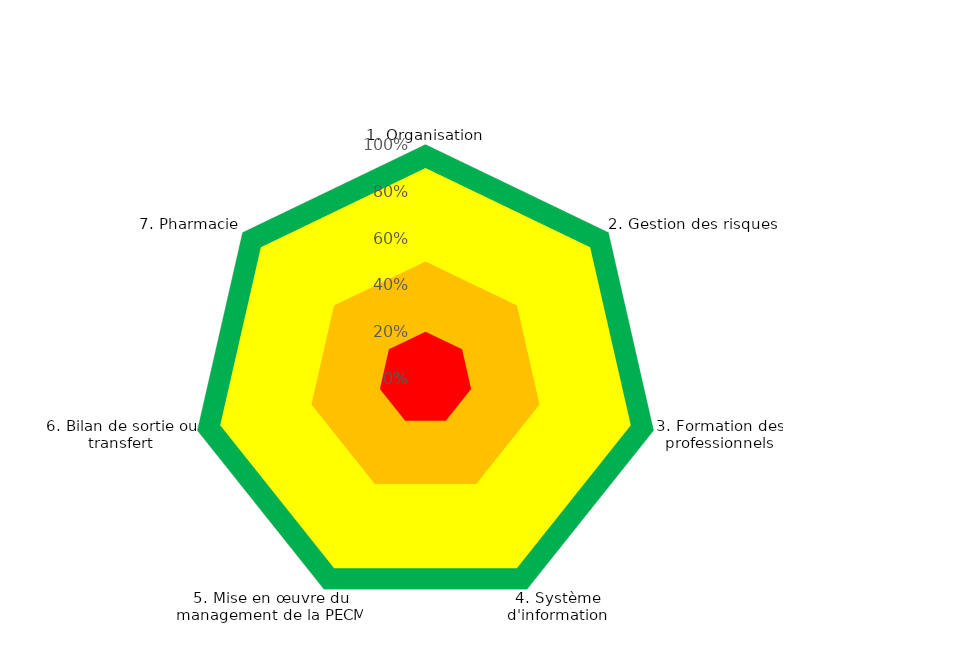
| Category | Series 1 | Zone 3 | Zone 2 | Zone 1 | Niveau de conformité |
|---|---|---|---|---|---|
| 1. Organisation | 1 | 0.9 | 0.5 | 0.2 | 0 |
| 2. Gestion des risques | 1 | 0.9 | 0.5 | 0.2 | 0 |
| 3. Formation des professionnels | 1 | 0.9 | 0.5 | 0.2 | 0 |
| 4. Système d'information | 1 | 0.9 | 0.5 | 0.2 | 0 |
| 5. Mise en œuvre du management de la PECM | 1 | 0.9 | 0.5 | 0.2 | 0 |
| 6. Bilan de sortie ou transfert | 1 | 0.9 | 0.5 | 0.2 | 0 |
| 7. Pharmacie | 1 | 0.9 | 0.5 | 0.2 | 0 |